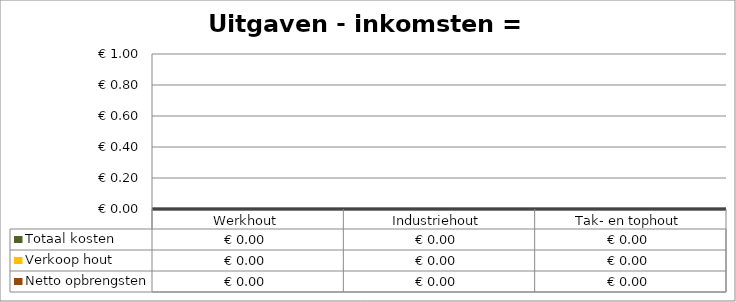
| Category | Totaal kosten | Verkoop hout | Netto opbrengsten |
|---|---|---|---|
| Werkhout | 0 | 0 | 0 |
| Industriehout | 0 | 0 | 0 |
| Tak- en tophout | 0 | 0 | 0 |